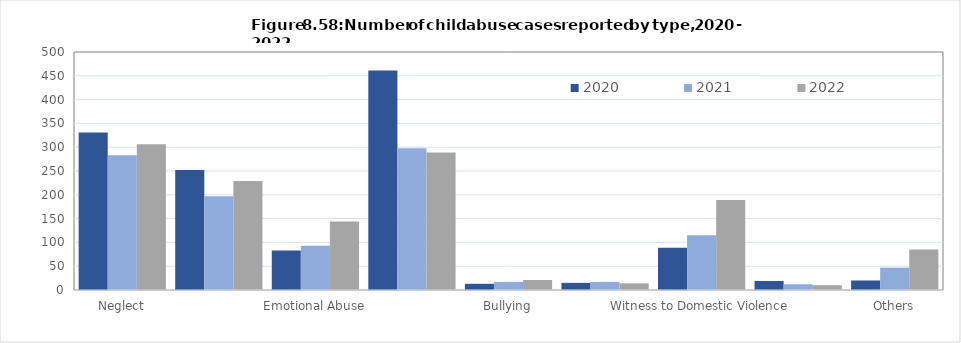
| Category | 2020  | 2021  | 2022  |
|---|---|---|---|
|  Neglect  | 331 | 283 | 306 |
|  Physical Abuse  | 252 | 197 | 229 |
|  Emotional Abuse  | 83 | 93 | 144 |
|  Sexual Abuse  | 461 | 298 | 289 |
|  Bullying  | 13 | 17 | 21 |
|  Harrasment  | 15 | 17 | 14 |
|  Witness to Domestic Violence  | 89 | 115 | 189 |
|  Cyber Bullying  | 19 | 12 | 10 |
|  Others  | 20 | 47 | 85 |